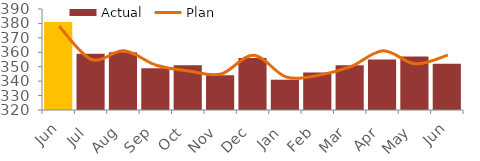
| Category | Actual |
|---|---|
| Jun | 381 |
| Jul | 359 |
| Aug | 360 |
| Sep | 349 |
| Oct | 351 |
| Nov | 344 |
| Dec | 356 |
| Jan | 341 |
| Feb | 346 |
| Mar | 351 |
| Apr | 355 |
| May | 357 |
| Jun | 352 |